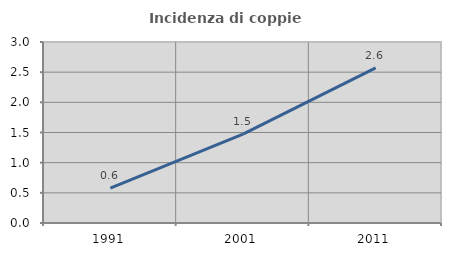
| Category | Incidenza di coppie miste |
|---|---|
| 1991.0 | 0.577 |
| 2001.0 | 1.473 |
| 2011.0 | 2.572 |